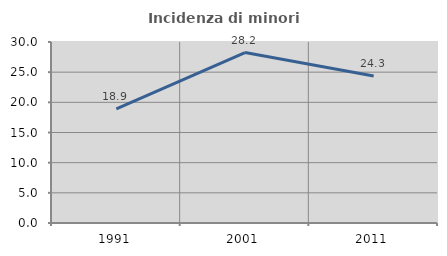
| Category | Incidenza di minori stranieri |
|---|---|
| 1991.0 | 18.919 |
| 2001.0 | 28.244 |
| 2011.0 | 24.35 |